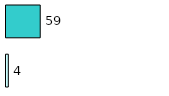
| Category | Series 0 | Series 1 |
|---|---|---|
| 0 | 4 | 59 |